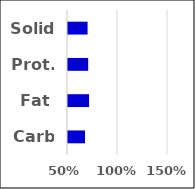
| Category | Value |
|---|---|
| Carb | 0.67 |
| Fat | 0.711 |
| Prot. | 0.702 |
| Solid | 0.696 |